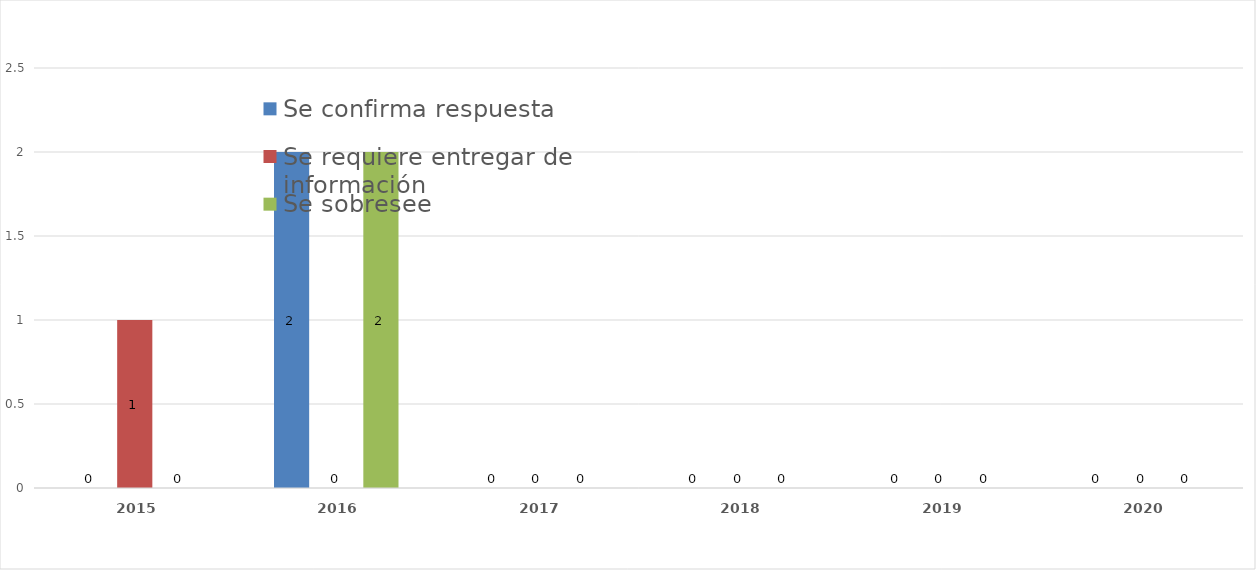
| Category | Se confirma respuesta | Se requiere entregar de información  | Se sobresee  |
|---|---|---|---|
| 2015.0 | 0 | 1 | 0 |
| 2016.0 | 2 | 0 | 2 |
| 2017.0 | 0 | 0 | 0 |
| 2018.0 | 0 | 0 | 0 |
| 2019.0 | 0 | 0 | 0 |
| 2020.0 | 0 | 0 | 0 |